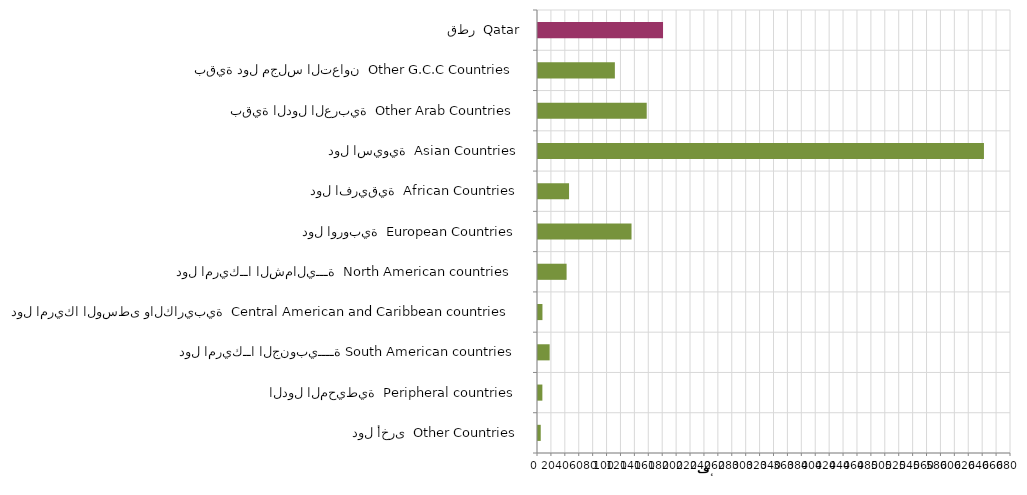
| Category | Series 0 |
|---|---|
| دول أخرى  Other Countries | 3944 |
| الدول المحيطية  Peripheral countries | 6286 |
| دول امريكــا الجنوبيــــة South American countries | 16739 |
| دول امريكا الوسطى والكاريبية  Central American and Caribbean countries | 6397 |
| دول امريكــا الشماليـــة  North American countries  | 41111 |
| دول اوروبية  European Countries | 134448 |
| دول افريقية  African Countries | 44642 |
| دول اسيوية  Asian Countries | 641109 |
| بقية الدول العربية  Other Arab Countries | 156310 |
| بقية دول مجلس التعاون  Other G.C.C Countries | 110511 |
| قطر  Qatar | 179757 |